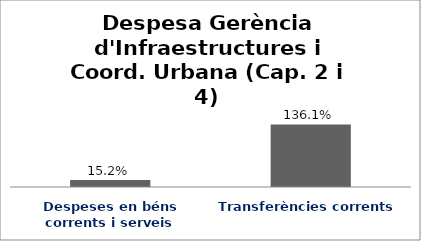
| Category | Series 0 |
|---|---|
| Despeses en béns corrents i serveis | 0.152 |
| Transferències corrents | 1.361 |